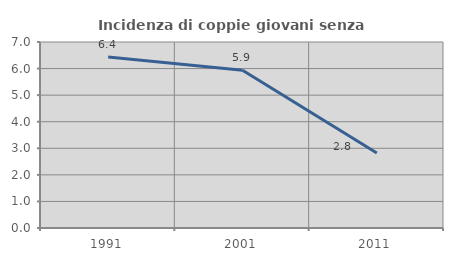
| Category | Incidenza di coppie giovani senza figli |
|---|---|
| 1991.0 | 6.44 |
| 2001.0 | 5.937 |
| 2011.0 | 2.822 |